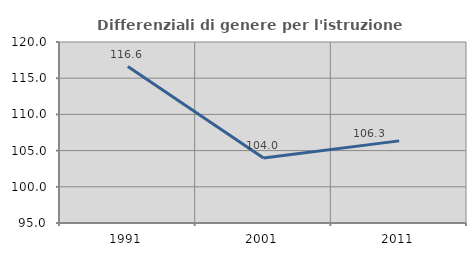
| Category | Differenziali di genere per l'istruzione superiore |
|---|---|
| 1991.0 | 116.604 |
| 2001.0 | 103.966 |
| 2011.0 | 106.344 |